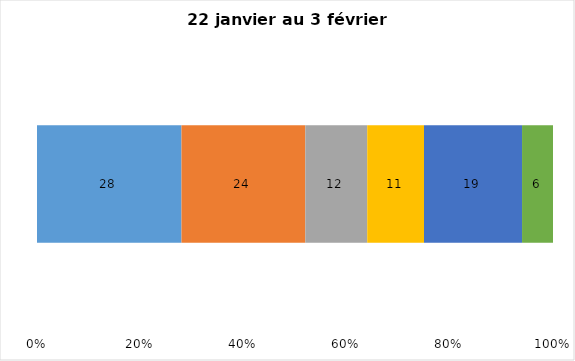
| Category | Plusieurs fois par jour | Une fois par jour | Quelques fois par semaine   | Une fois par semaine ou moins   |  Jamais   |  Je n’utilise pas les médias sociaux |
|---|---|---|---|---|---|---|
| 0 | 28 | 24 | 12 | 11 | 19 | 6 |